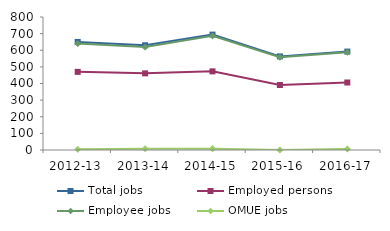
| Category | Total jobs | Employed persons | Employee jobs | OMUE jobs |
|---|---|---|---|---|
| 2012-13 | 650 | 470 | 640 | 4 |
| 2013-14 | 630 | 461 | 619 | 8 |
| 2014-15 | 694 | 473 | 687 | 8 |
| 2015-16 | 563 | 391 | 558 | 0 |
| 2016-17 | 592 | 406 | 588 | 6 |